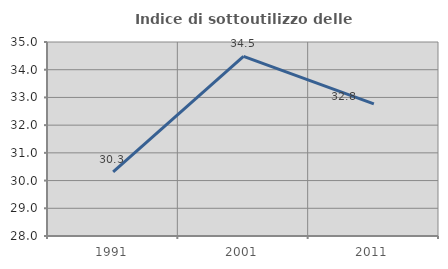
| Category | Indice di sottoutilizzo delle abitazioni  |
|---|---|
| 1991.0 | 30.31 |
| 2001.0 | 34.483 |
| 2011.0 | 32.767 |